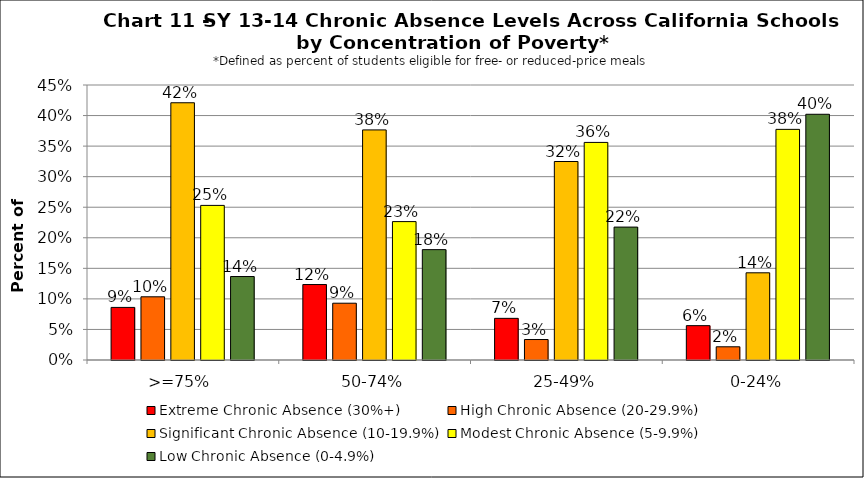
| Category | Extreme Chronic Absence (30%+) | High Chronic Absence (20-29.9%) | Significant Chronic Absence (10-19.9%) | Modest Chronic Absence (5-9.9%) | Low Chronic Absence (0-4.9%) |
|---|---|---|---|---|---|
| 0 | 0.086 | 0.103 | 0.421 | 0.253 | 0.137 |
| 1 | 0.123 | 0.093 | 0.377 | 0.226 | 0.181 |
| 2 | 0.068 | 0.034 | 0.325 | 0.356 | 0.217 |
| 3 | 0.056 | 0.022 | 0.143 | 0.377 | 0.402 |